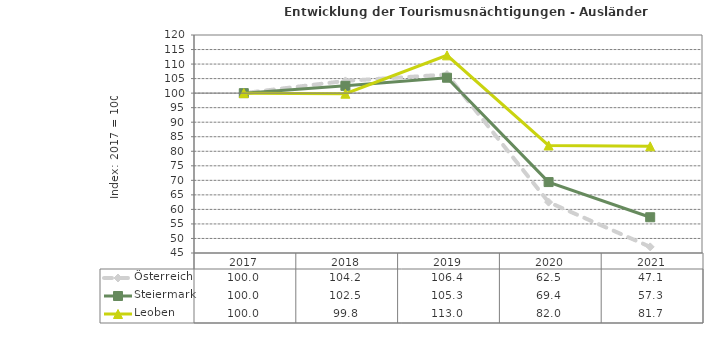
| Category | Österreich | Steiermark | Leoben |
|---|---|---|---|
| 2021.0 | 47.1 | 57.3 | 81.7 |
| 2020.0 | 62.5 | 69.4 | 82 |
| 2019.0 | 106.4 | 105.3 | 113 |
| 2018.0 | 104.2 | 102.5 | 99.8 |
| 2017.0 | 100 | 100 | 100 |